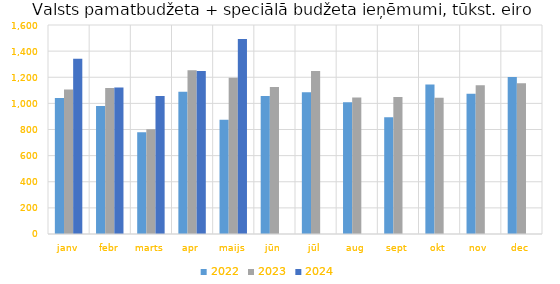
| Category | 2022 | 2023 | 2024 |
|---|---|---|---|
| janv | 1040582.151 | 1106694.936 | 1340794.093 |
| febr | 979083.527 | 1117281.777 | 1121021.341 |
| marts | 778451.361 | 802572.118 | 1056767.586 |
| apr | 1089522.586 | 1254540.122 | 1246954.031 |
| maijs | 873781.393 | 1197075.215 | 1493709.704 |
| jūn | 1056226.576 | 1125656.105 | 0 |
| jūl | 1084656.571 | 1247090.946 | 0 |
| aug | 1009449.844 | 1044839.258 | 0 |
| sept | 894284.855 | 1048693.583 | 0 |
| okt | 1144151.024 | 1042398.987 | 0 |
| nov | 1072959.66 | 1138266.556 | 0 |
| dec | 1201924.058 | 1154996.585 | 0 |